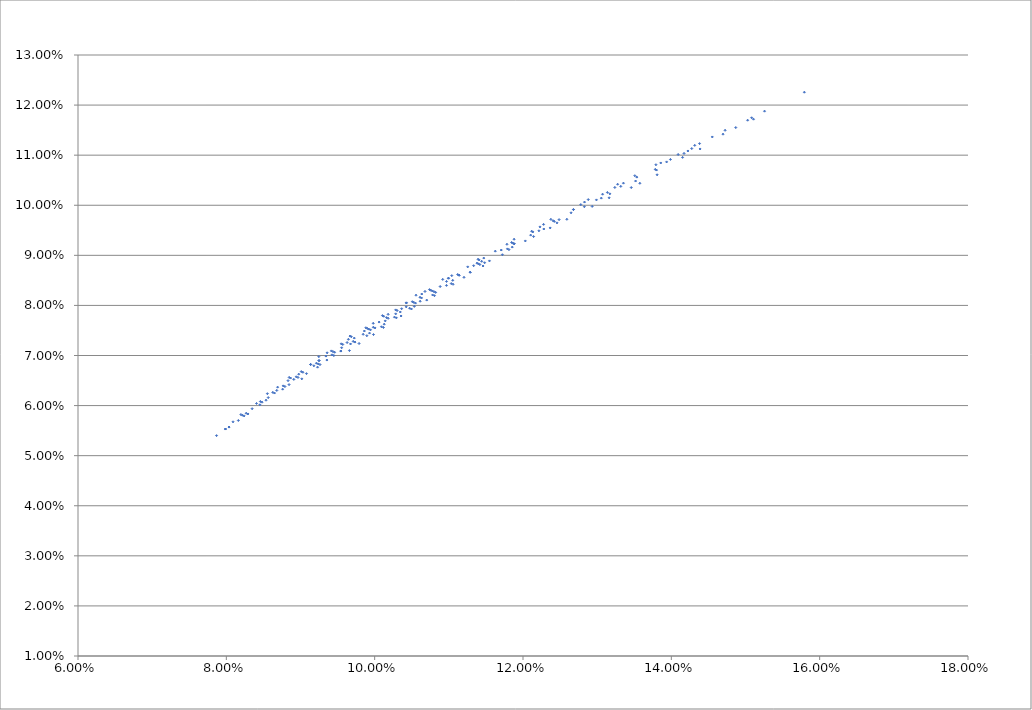
| Category | Series 0 |
|---|---|
| 0.07868170979741455 | 0.054 |
| 0.08196572309601664 | 0.058 |
| 0.08553721019090407 | 0.062 |
| 0.0884710288371038 | 0.066 |
| 0.09247144620118564 | 0.07 |
| 0.09667202304784779 | 0.074 |
| 0.10104780045290569 | 0.078 |
| 0.10557699641095412 | 0.082 |
| 0.10917667955173155 | 0.085 |
| 0.11393420209569619 | 0.089 |
| 0.11879866882674288 | 0.093 |
| 0.12375746959844922 | 0.097 |
| 0.1287997092636384 | 0.101 |
| 0.1327589803505239 | 0.104 |
| 0.13792755904151477 | 0.108 |
| 0.14315635676131216 | 0.112 |
| 0.14724799359336815 | 0.115 |
| 0.15256904472974586 | 0.119 |
| 0.15793454802798385 | 0.123 |
| 0.08452616476205077 | 0.06 |
| 0.0864943088717075 | 0.063 |
| 0.08942783966471753 | 0.066 |
| 0.09249956612896841 | 0.069 |
| 0.09569618147053323 | 0.072 |
| 0.09900558948402843 | 0.075 |
| 0.10283096666424209 | 0.079 |
| 0.10634975618588202 | 0.082 |
| 0.10995040592710664 | 0.085 |
| 0.11471116473551235 | 0.089 |
| 0.11847014484937984 | 0.093 |
| 0.12228841855765851 | 0.096 |
| 0.12680387253320996 | 0.099 |
| 0.1307287573736904 | 0.102 |
| 0.13535169920619605 | 0.106 |
| 0.13936417120410033 | 0.109 |
| 0.14223299836180517 | 0.111 |
| 0.14697011469596175 | 0.114 |
| 0.15107805913405978 | 0.117 |
| 0.09017859093786722 | 0.065 |
| 0.09230117652189927 | 0.068 |
| 0.0944920987934465 | 0.07 |
| 0.09674671521416188 | 0.072 |
| 0.10004918255248378 | 0.076 |
| 0.10182003651118478 | 0.077 |
| 0.10528330530920639 | 0.081 |
| 0.10778077986639811 | 0.083 |
| 0.11138797518388097 | 0.086 |
| 0.11443023130140965 | 0.089 |
| 0.11881382323034353 | 0.092 |
| 0.1221502346398948 | 0.095 |
| 0.12486949738473924 | 0.097 |
| 0.12827360351557426 | 0.1 |
| 0.1317105182799772 | 0.102 |
| 0.13517773920748088 | 0.105 |
| 0.13800186139882173 | 0.107 |
| 0.14151906250038707 | 0.11 |
| 0.14387752495800418 | 0.111 |
| 0.09659765724882262 | 0.071 |
| 0.0978923797197846 | 0.072 |
| 0.09984086570593423 | 0.074 |
| 0.10118495172476939 | 0.076 |
| 0.10356118445271564 | 0.078 |
| 0.10534658908144871 | 0.08 |
| 0.10781575351404794 | 0.082 |
| 0.1103290088951418 | 0.084 |
| 0.11288341031809179 | 0.087 |
| 0.11482594869982317 | 0.089 |
| 0.1181049297759731 | 0.091 |
| 0.12142638784430974 | 0.094 |
| 0.12366260315615328 | 0.095 |
| 0.1259152579687299 | 0.097 |
| 0.1293231833370381 | 0.1 |
| 0.13161326322692865 | 0.101 |
| 0.13459846310570725 | 0.104 |
| 0.13575660912136064 | 0.104 |
| 0.13808216387790578 | 0.106 |
| 0.08090552908369016 | 0.057 |
| 0.08407371228220498 | 0.06 |
| 0.0869155531720654 | 0.064 |
| 0.08866363377655247 | 0.065 |
| 0.09136817944709975 | 0.068 |
| 0.09359345943975393 | 0.071 |
| 0.09549511542420529 | 0.072 |
| 0.09684999713779809 | 0.074 |
| 0.09980559194187938 | 0.076 |
| 0.10121888326309765 | 0.078 |
| 0.10427685052032087 | 0.081 |
| 0.10678446417126143 | 0.083 |
| 0.11039901209543483 | 0.086 |
| 0.11408645906503277 | 0.089 |
| 0.11783996181004024 | 0.092 |
| 0.12277412166379643 | 0.096 |
| 0.12829514341388532 | 0.101 |
| 0.13507612213158063 | 0.106 |
| 0.14552402220392588 | 0.114 |
| 0.08347851512189954 | 0.059 |
| 0.08680590897113674 | 0.063 |
| 0.08976378909546412 | 0.066 |
| 0.09249956612896841 | 0.069 |
| 0.09437302194474016 | 0.071 |
| 0.09725187905904423 | 0.073 |
| 0.09921379972710477 | 0.075 |
| 0.10160508480589416 | 0.078 |
| 0.10363631921102232 | 0.079 |
| 0.10611279279565058 | 0.082 |
| 0.10969200264723633 | 0.085 |
| 0.1133468318113691 | 0.088 |
| 0.11707019819592517 | 0.091 |
| 0.12132919309256518 | 0.095 |
| 0.12680387253320996 | 0.099 |
| 0.13353907747945723 | 0.104 |
| 0.14092180625816242 | 0.11 |
| 0.15082798666173627 | 0.117 |
| 0.08036555981111113 | 0.056 |
| 0.0848177727902654 | 0.061 |
| 0.08909880021899443 | 0.065 |
| 0.091802746248085 | 0.068 |
| 0.09459761900741682 | 0.071 |
| 0.09710808925032542 | 0.073 |
| 0.0994368649186813 | 0.075 |
| 0.10142992218885709 | 0.077 |
| 0.10345293200849931 | 0.079 |
| 0.10550417139909102 | 0.08 |
| 0.10799382779838036 | 0.083 |
| 0.11052657655858042 | 0.085 |
| 0.1141799846673195 | 0.088 |
| 0.1179015345894352 | 0.091 |
| 0.12103371221016894 | 0.094 |
| 0.12648004156323361 | 0.098 |
| 0.13318802416276682 | 0.104 |
| 0.13988010205499507 | 0.109 |
| 0.15028859304514808 | 0.117 |
| 0.08239995543743514 | 0.058 |
| 0.08846175808971424 | 0.064 |
| 0.09263004185286469 | 0.068 |
| 0.09543728650574673 | 0.071 |
| 0.09894352875565253 | 0.074 |
| 0.10091871096766433 | 0.076 |
| 0.10292468887329863 | 0.078 |
| 0.10495969679592124 | 0.079 |
| 0.10702207874478119 | 0.081 |
| 0.10806304601186005 | 0.082 |
| 0.11056803308146429 | 0.084 |
| 0.11204320463343646 | 0.086 |
| 0.11461473649702364 | 0.088 |
| 0.11722336184954878 | 0.09 |
| 0.12031473171861785 | 0.093 |
| 0.1245854399251657 | 0.096 |
| 0.1305613940494141 | 0.101 |
| 0.13783650504539796 | 0.107 |
| 0.07988230766099597 | 0.055 |
| 0.08217387564606003 | 0.058 |
| 0.08459152371897742 | 0.061 |
| 0.08626812187663044 | 0.063 |
| 0.08832489957565838 | 0.065 |
| 0.09010657122260206 | 0.067 |
| 0.09136817944709975 | 0.068 |
| 0.09416403645473316 | 0.071 |
| 0.09645937310961039 | 0.073 |
| 0.09881232809333955 | 0.076 |
| 0.10181513612330574 | 0.078 |
| 0.10427685052032087 | 0.081 |
| 0.10739589407794965 | 0.083 |
| 0.10995040592710664 | 0.085 |
| 0.1125443294242091 | 0.088 |
| 0.11626855625467787 | 0.091 |
| 0.1211697332423479 | 0.095 |
| 0.12779428610005775 | 0.1 |
| 0.08036555981111113 | 0.056 |
| 0.08267919802060379 | 0.058 |
| 0.08564982426838781 | 0.062 |
| 0.08766843675663619 | 0.064 |
| 0.09032404574529136 | 0.067 |
| 0.09214786197654104 | 0.068 |
| 0.09343153041437827 | 0.07 |
| 0.09628346599210805 | 0.073 |
| 0.09861423609575365 | 0.075 |
| 0.10060044452506642 | 0.077 |
| 0.10302394920161742 | 0.079 |
| 0.10507644508837485 | 0.081 |
| 0.10758144317691413 | 0.083 |
| 0.11119605629377458 | 0.086 |
| 0.11379702518255964 | 0.088 |
| 0.11863570092912262 | 0.092 |
| 0.12405255854402096 | 0.097 |
| 0.13238335837803888 | 0.104 |
| 0.14380773284778547 | 0.112 |
| 0.0816214178725334 | 0.057 |
| 0.08535179961964223 | 0.061 |
| 0.08790285961449866 | 0.064 |
| 0.08966183330282046 | 0.066 |
| 0.09238103804124316 | 0.068 |
| 0.09424404676813382 | 0.07 |
| 0.09554807758767886 | 0.072 |
| 0.09845213801889378 | 0.074 |
| 0.0998189337270673 | 0.076 |
| 0.1028317697422843 | 0.078 |
| 0.10425387373473446 | 0.08 |
| 0.10631939530889542 | 0.081 |
| 0.10883284019802573 | 0.084 |
| 0.11138797518388097 | 0.086 |
| 0.11398199659962431 | 0.088 |
| 0.11881382323034353 | 0.092 |
| 0.12421820073284329 | 0.097 |
| 0.13137941592063873 | 0.103 |
| 0.14275473677566872 | 0.111 |
| 0.08291419633074269 | 0.058 |
| 0.08759375038797738 | 0.063 |
| 0.0908076736210795 | 0.066 |
| 0.09355625616218816 | 0.069 |
| 0.09543728650574673 | 0.071 |
| 0.0973546057442124 | 0.073 |
| 0.09930611199305969 | 0.074 |
| 0.10128982927363071 | 0.076 |
| 0.10267412609699628 | 0.078 |
| 0.10471043225265513 | 0.079 |
| 0.10613673561698864 | 0.081 |
| 0.10822050599511818 | 0.083 |
| 0.10968498216312067 | 0.084 |
| 0.11288341031809179 | 0.087 |
| 0.11547622729192832 | 0.089 |
| 0.11855247320486292 | 0.092 |
| 0.12280353392073101 | 0.095 |
| 0.12990101846700775 | 0.101 |
| 0.14171447982874014 | 0.11 |
| 0.07988230766099597 | 0.055 |
| 0.14868807023738032 | 0.116 |
| 0.13857485714886406 | 0.108 |